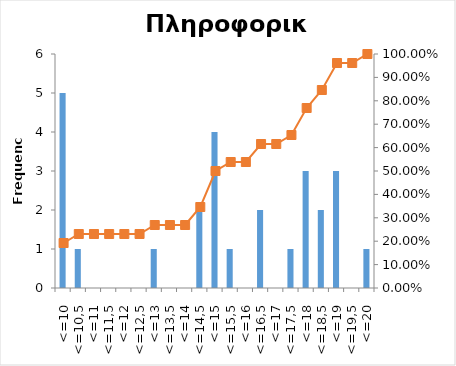
| Category | Series 0 |
|---|---|
| <=10 | 5 |
| <=10,5 | 1 |
| <=11 | 0 |
| <=11,5 | 0 |
| <=12 | 0 |
| <=12,5 | 0 |
| <=13 | 1 |
| <=13,5 | 0 |
| <=14 | 0 |
| <=14,5 | 2 |
| <=15 | 4 |
| <=15,5 | 1 |
| <=16 | 0 |
| <=16,5 | 2 |
| <=17 | 0 |
| <=17,5 | 1 |
| <=18 | 3 |
| <=18,5 | 2 |
| <=19 | 3 |
| <=19,5 | 0 |
| <=20 | 1 |